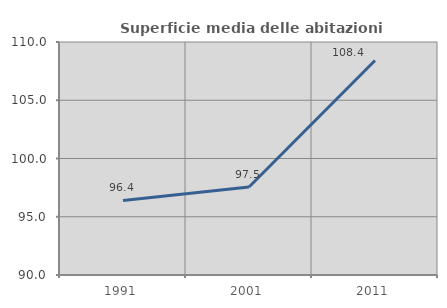
| Category | Superficie media delle abitazioni occupate |
|---|---|
| 1991.0 | 96.404 |
| 2001.0 | 97.549 |
| 2011.0 | 108.417 |